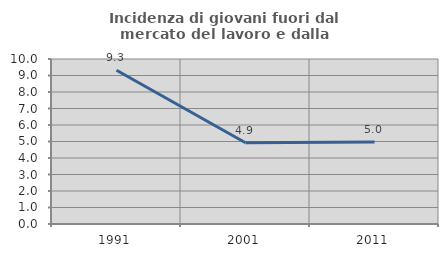
| Category | Incidenza di giovani fuori dal mercato del lavoro e dalla formazione  |
|---|---|
| 1991.0 | 9.32 |
| 2001.0 | 4.923 |
| 2011.0 | 4.965 |